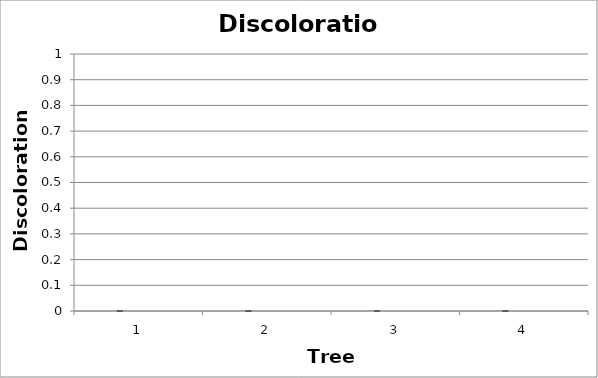
| Category | Series 0 | Check |
|---|---|---|
| 0 | 0 |  |
| 1 | 0 |  |
| 2 | 0 |  |
| 3 | 0 |  |